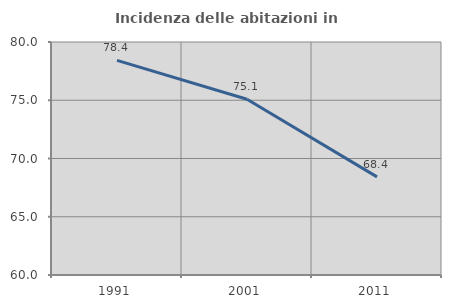
| Category | Incidenza delle abitazioni in proprietà  |
|---|---|
| 1991.0 | 78.424 |
| 2001.0 | 75.088 |
| 2011.0 | 68.421 |